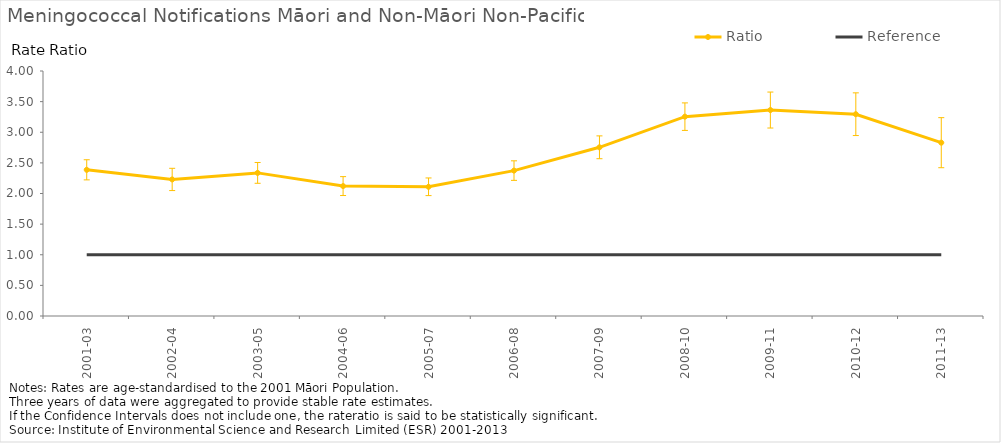
| Category | Ratio | Reference |
|---|---|---|
| 2001-03 | 2.387 | 1 |
| 2002-04 | 2.23 | 1 |
| 2003-05 | 2.336 | 1 |
| 2004-06 | 2.121 | 1 |
| 2005-07 | 2.11 | 1 |
| 2006-08 | 2.374 | 1 |
| 2007-09 | 2.754 | 1 |
| 2008-10 | 3.255 | 1 |
| 2009-11 | 3.363 | 1 |
| 2010-12 | 3.295 | 1 |
| 2011-13 | 2.83 | 1 |